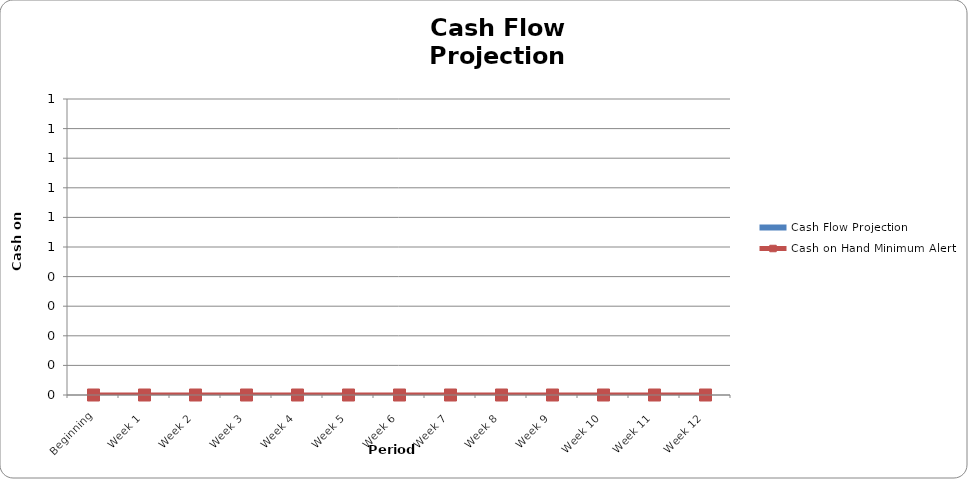
| Category | Cash Flow Projection |
|---|---|
| Beginning | 0 |
| Week 1 | 0 |
| Week 2 | 0 |
| Week 3 | 0 |
| Week 4 | 0 |
| Week 5 | 0 |
| Week 6 | 0 |
| Week 7 | 0 |
| Week 8 | 0 |
| Week 9 | 0 |
| Week 10 | 0 |
| Week 11 | 0 |
| Week 12 | 0 |